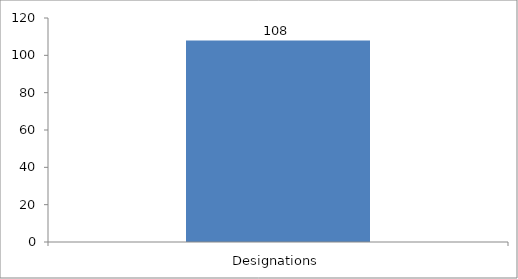
| Category | Principals |
|---|---|
| Designations | 108 |